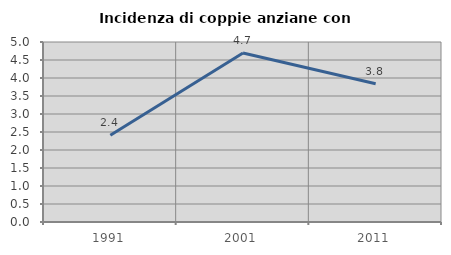
| Category | Incidenza di coppie anziane con figli |
|---|---|
| 1991.0 | 2.412 |
| 2001.0 | 4.695 |
| 2011.0 | 3.841 |